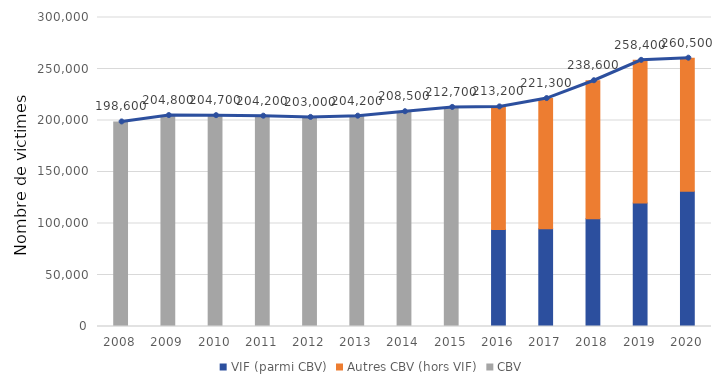
| Category | VIF (parmi CBV) | Autres CBV (hors VIF) | CBV |
|---|---|---|---|
| 2008.0 | 0 | 0 | 198600 |
| 2009.0 | 0 | 0 | 204800 |
| 2010.0 | 0 | 0 | 204700 |
| 2011.0 | 0 | 0 | 204200 |
| 2012.0 | 0 | 0 | 203000 |
| 2013.0 | 0 | 0 | 204200 |
| 2014.0 | 0 | 0 | 208500 |
| 2015.0 | 0 | 0 | 212700 |
| 2016.0 | 94200 | 119000 | 0 |
| 2017.0 | 95000 | 126300 | 0 |
| 2018.0 | 104700 | 133900 | 0 |
| 2019.0 | 119800 | 138600 | 0 |
| 2020.0 | 131200 | 129300 | 0 |